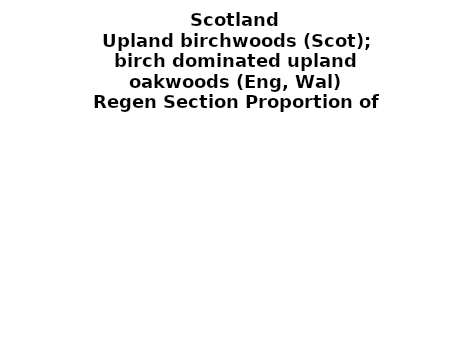
| Category | Upland birchwoods (Scot); birch dominated upland oakwoods (Eng, Wal) |
|---|---|
| None | 0.117 |
| Seedlings only | 0 |
| Seedlings, saplings only | 0.054 |
| Seedlings, saplings, <7 cm trees | 0.084 |
| Saplings only | 0.241 |
| <7 cm trees, seedlings only | 0 |
| <7 cm trees, saplings only | 0.364 |
| <7 cm Trees only | 0.14 |